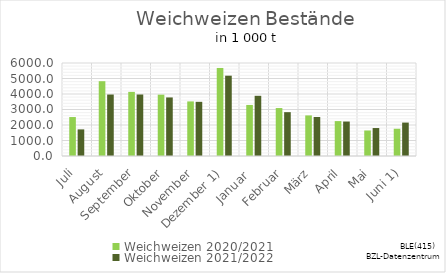
| Category | Weichweizen |
|---|---|
| Juli | 1717.17 |
| August | 3965.506 |
| September | 3967.264 |
| Oktober | 3778.139 |
| November | 3495.718 |
| Dezember 1) | 5181.16 |
| Januar  | 3883.791 |
| Februar | 2828.825 |
| März | 2518.058 |
| April | 2223.301 |
| Mai | 1804.131 |
| Juni 1) | 2155.785 |